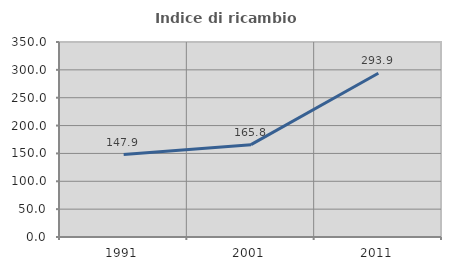
| Category | Indice di ricambio occupazionale  |
|---|---|
| 1991.0 | 147.917 |
| 2001.0 | 165.789 |
| 2011.0 | 293.939 |